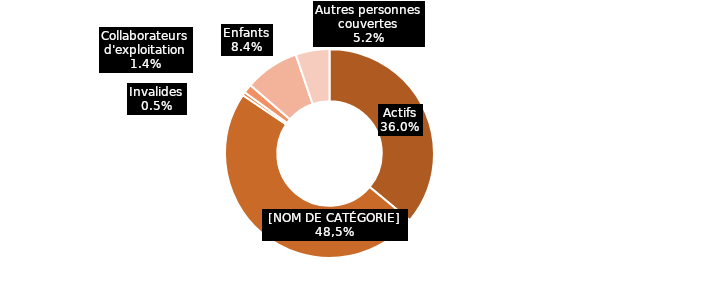
| Category | Tranches âge |
|---|---|
| Actifs | 0.36 |
| Retraités | 0.484 |
| Invalides | 0.005 |
| Collaborateurs d'exploitation | 0.014 |
| Enfants | 0.084 |
| Autres personnes couvertes | 0.052 |